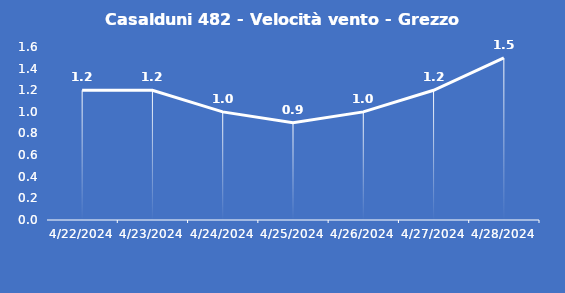
| Category | Casalduni 482 - Velocità vento - Grezzo (m/s) |
|---|---|
| 4/22/24 | 1.2 |
| 4/23/24 | 1.2 |
| 4/24/24 | 1 |
| 4/25/24 | 0.9 |
| 4/26/24 | 1 |
| 4/27/24 | 1.2 |
| 4/28/24 | 1.5 |